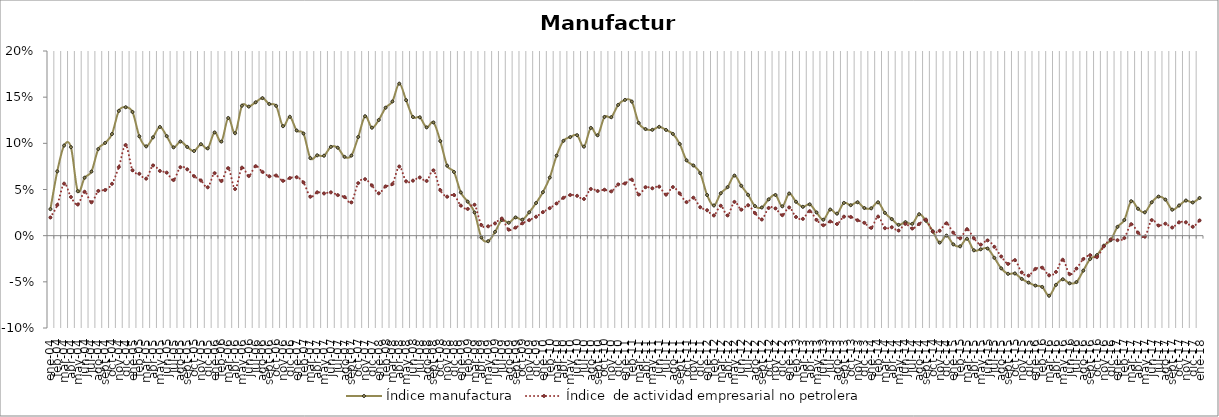
| Category | Índice manufactura | Índice  de actividad empresarial no petrolera |
|---|---|---|
| 2004-01-01 | 0.029 | 0.02 |
| 2004-02-01 | 0.07 | 0.033 |
| 2004-03-01 | 0.098 | 0.056 |
| 2004-04-01 | 0.096 | 0.042 |
| 2004-05-01 | 0.048 | 0.034 |
| 2004-06-01 | 0.063 | 0.048 |
| 2004-07-01 | 0.069 | 0.036 |
| 2004-08-01 | 0.094 | 0.048 |
| 2004-09-01 | 0.1 | 0.049 |
| 2004-10-01 | 0.11 | 0.056 |
| 2004-11-01 | 0.135 | 0.074 |
| 2004-12-01 | 0.139 | 0.098 |
| 2005-01-01 | 0.134 | 0.071 |
| 2005-02-01 | 0.108 | 0.067 |
| 2005-03-01 | 0.097 | 0.062 |
| 2005-04-01 | 0.106 | 0.076 |
| 2005-05-01 | 0.118 | 0.07 |
| 2005-06-01 | 0.108 | 0.068 |
| 2005-07-01 | 0.096 | 0.06 |
| 2005-08-01 | 0.102 | 0.074 |
| 2005-09-01 | 0.096 | 0.072 |
| 2005-10-01 | 0.092 | 0.064 |
| 2005-11-01 | 0.099 | 0.06 |
| 2005-12-01 | 0.095 | 0.052 |
| 2006-01-01 | 0.112 | 0.068 |
| 2006-02-01 | 0.102 | 0.059 |
| 2006-03-01 | 0.127 | 0.073 |
| 2006-04-01 | 0.111 | 0.051 |
| 2006-05-01 | 0.141 | 0.074 |
| 2006-06-01 | 0.14 | 0.065 |
| 2006-07-01 | 0.144 | 0.075 |
| 2006-08-01 | 0.149 | 0.069 |
| 2006-09-01 | 0.143 | 0.064 |
| 2006-10-01 | 0.141 | 0.065 |
| 2006-11-01 | 0.119 | 0.059 |
| 2006-12-01 | 0.129 | 0.062 |
| 2007-01-01 | 0.114 | 0.063 |
| 2007-02-01 | 0.111 | 0.058 |
| 2007-03-01 | 0.084 | 0.042 |
| 2007-04-01 | 0.087 | 0.047 |
| 2007-05-01 | 0.087 | 0.046 |
| 2007-06-01 | 0.096 | 0.047 |
| 2007-07-01 | 0.095 | 0.044 |
| 2007-08-01 | 0.085 | 0.042 |
| 2007-09-01 | 0.087 | 0.036 |
| 2007-10-01 | 0.107 | 0.057 |
| 2007-11-01 | 0.129 | 0.061 |
| 2007-12-01 | 0.117 | 0.054 |
| 2008-01-01 | 0.125 | 0.046 |
| 2008-02-01 | 0.139 | 0.053 |
| 2008-03-01 | 0.145 | 0.056 |
| 2008-04-01 | 0.165 | 0.075 |
| 2008-05-01 | 0.147 | 0.059 |
| 2008-06-01 | 0.128 | 0.06 |
| 2008-07-01 | 0.128 | 0.063 |
| 2008-08-01 | 0.117 | 0.059 |
| 2008-09-01 | 0.123 | 0.071 |
| 2008-10-01 | 0.102 | 0.049 |
| 2008-11-01 | 0.076 | 0.042 |
| 2008-12-01 | 0.069 | 0.044 |
| 2009-01-01 | 0.047 | 0.033 |
| 2009-02-01 | 0.037 | 0.029 |
| 2009-03-01 | 0.025 | 0.033 |
| 2009-04-01 | -0.002 | 0.012 |
| 2009-05-01 | -0.006 | 0.01 |
| 2009-06-01 | 0.004 | 0.013 |
| 2009-07-01 | 0.017 | 0.019 |
| 2009-08-01 | 0.014 | 0.006 |
| 2009-09-01 | 0.02 | 0.009 |
| 2009-10-01 | 0.017 | 0.013 |
| 2009-11-01 | 0.025 | 0.017 |
| 2009-12-01 | 0.035 | 0.02 |
| 2010-01-01 | 0.047 | 0.026 |
| 2010-02-01 | 0.063 | 0.03 |
| 2010-03-01 | 0.087 | 0.035 |
| 2010-04-01 | 0.103 | 0.041 |
| 2010-05-01 | 0.107 | 0.044 |
| 2010-06-01 | 0.109 | 0.043 |
| 2010-07-01 | 0.096 | 0.04 |
| 2010-08-01 | 0.117 | 0.051 |
| 2010-09-01 | 0.109 | 0.048 |
| 2010-10-01 | 0.129 | 0.05 |
| 2010-11-01 | 0.128 | 0.048 |
| 2010-12-01 | 0.142 | 0.055 |
| 2011-01-01 | 0.147 | 0.057 |
| 2011-02-01 | 0.145 | 0.061 |
| 2011-03-01 | 0.122 | 0.045 |
| 2011-04-01 | 0.115 | 0.053 |
| 2011-05-01 | 0.115 | 0.051 |
| 2011-06-01 | 0.118 | 0.053 |
| 2011-07-01 | 0.115 | 0.044 |
| 2011-08-01 | 0.11 | 0.053 |
| 2011-09-01 | 0.099 | 0.046 |
| 2011-10-01 | 0.082 | 0.036 |
| 2011-11-01 | 0.076 | 0.041 |
| 2011-12-01 | 0.068 | 0.031 |
| 2012-01-01 | 0.044 | 0.028 |
| 2012-02-01 | 0.033 | 0.022 |
| 2012-03-01 | 0.046 | 0.032 |
| 2012-04-01 | 0.053 | 0.022 |
| 2012-05-01 | 0.065 | 0.037 |
| 2012-06-01 | 0.054 | 0.028 |
| 2012-07-01 | 0.044 | 0.033 |
| 2012-08-01 | 0.032 | 0.024 |
| 2012-09-01 | 0.031 | 0.018 |
| 2012-10-01 | 0.039 | 0.03 |
| 2012-11-01 | 0.044 | 0.03 |
| 2012-12-01 | 0.032 | 0.022 |
| 2013-01-01 | 0.046 | 0.031 |
| 2013-02-01 | 0.037 | 0.02 |
| 2013-03-01 | 0.031 | 0.018 |
| 2013-04-01 | 0.034 | 0.027 |
| 2013-05-01 | 0.025 | 0.017 |
| 2013-06-01 | 0.017 | 0.011 |
| 2013-07-01 | 0.028 | 0.015 |
| 2013-08-01 | 0.024 | 0.013 |
| 2013-09-01 | 0.035 | 0.021 |
| 2013-10-01 | 0.033 | 0.02 |
| 2013-11-01 | 0.036 | 0.017 |
| 2013-12-01 | 0.03 | 0.014 |
| 2014-01-01 | 0.03 | 0.008 |
| 2014-02-01 | 0.036 | 0.021 |
| 2014-03-01 | 0.025 | 0.008 |
| 2014-04-01 | 0.018 | 0.009 |
| 2014-05-01 | 0.012 | 0.006 |
| 2014-06-01 | 0.015 | 0.013 |
| 2014-07-01 | 0.013 | 0.008 |
| 2014-08-01 | 0.023 | 0.013 |
| 2014-09-01 | 0.016 | 0.017 |
| 2014-10-01 | 0.005 | 0.004 |
| 2014-11-01 | -0.008 | 0.005 |
| 2014-12-01 | 0 | 0.013 |
| 2015-01-01 | -0.009 | 0.003 |
| 2015-02-01 | -0.012 | -0.003 |
| 2015-03-01 | -0.003 | 0.007 |
| 2015-04-01 | -0.016 | -0.003 |
| 2015-05-01 | -0.015 | -0.01 |
| 2015-06-01 | -0.014 | -0.005 |
| 2015-07-01 | -0.024 | -0.012 |
| 2015-08-01 | -0.035 | -0.023 |
| 2015-09-01 | -0.041 | -0.031 |
| 2015-10-01 | -0.041 | -0.026 |
| 2015-11-01 | -0.047 | -0.04 |
| 2015-12-01 | -0.051 | -0.043 |
| 2016-01-01 | -0.054 | -0.036 |
| 2016-02-01 | -0.056 | -0.035 |
| 2016-03-01 | -0.065 | -0.043 |
| 2016-04-01 | -0.053 | -0.039 |
| 2016-05-01 | -0.047 | -0.026 |
| 2016-06-01 | -0.052 | -0.042 |
| 2016-07-01 | -0.05 | -0.036 |
| 2016-08-01 | -0.038 | -0.025 |
| 2016-09-01 | -0.025 | -0.021 |
| 2016-10-01 | -0.021 | -0.023 |
| 2016-11-01 | -0.011 | -0.012 |
| 2016-12-01 | -0.005 | -0.004 |
| 2017-01-01 | 0.01 | -0.005 |
| 2017-02-01 | 0.017 | -0.003 |
| 2017-03-01 | 0.037 | 0.012 |
| 2017-04-01 | 0.029 | 0.003 |
| 2017-05-01 | 0.025 | -0.001 |
| 2017-06-01 | 0.036 | 0.017 |
| 2017-07-01 | 0.042 | 0.011 |
| 2017-08-01 | 0.039 | 0.013 |
| 2017-09-01 | 0.028 | 0.009 |
| 2017-10-01 | 0.033 | 0.014 |
| 2017-11-01 | 0.038 | 0.014 |
| 2017-12-01 | 0.036 | 0.01 |
| 2018-01-01 | 0.041 | 0.016 |